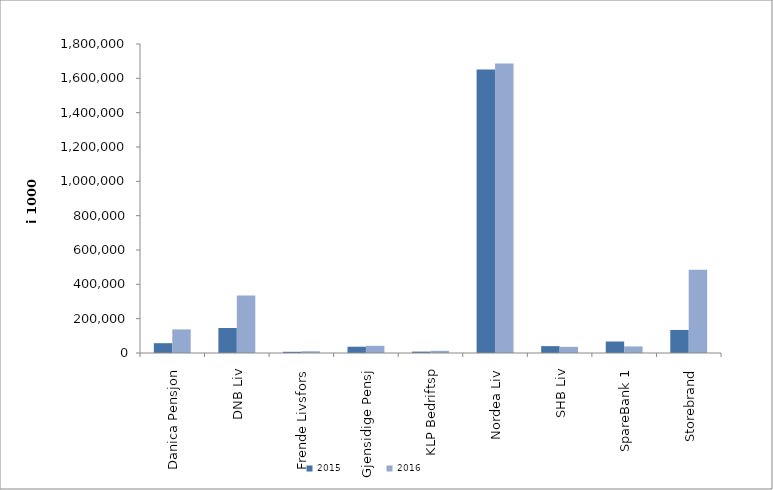
| Category | 2015 | 2016 |
|---|---|---|
| 0 | 57122.986 | 137548.952 |
| 1 | 145662.89 | 334918.303 |
| 2 | 6994 | 10257 |
| 3 | 36594.599 | 41910.925 |
| 4 | 8155 | 12682 |
| 5 | 1651276.157 | 1685828.199 |
| 6 | 40037 | 36000 |
| 7 | 66930.218 | 38294.238 |
| 8 | 134306.293 | 485572.022 |